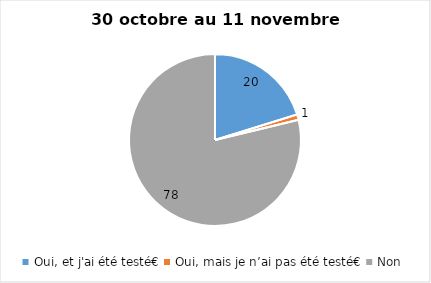
| Category | Series 0 |
|---|---|
| Oui, et j'ai été testé€ | 20 |
| Oui, mais je n’ai pas été testé€ | 1 |
| Non | 78 |